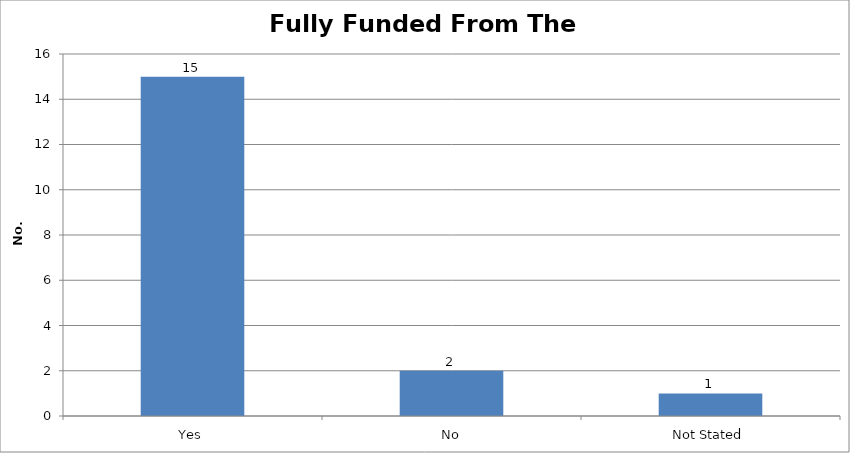
| Category | Yes |
|---|---|
| Yes | 15 |
| No | 2 |
| Not Stated | 1 |